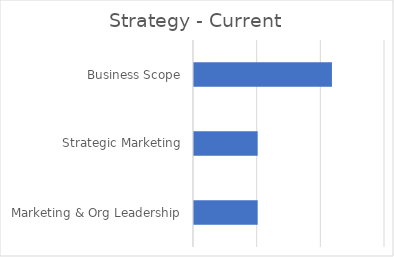
| Category | Current Scope |
|---|---|
| Marketing & Org Leadership | 1 |
| Strategic Marketing | 1 |
| Business Scope | 2.167 |